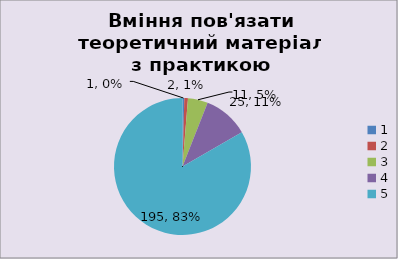
| Category | Кількість | % |
|---|---|---|
| 0 | 1 | 0.004 |
| 1 | 2 | 0.009 |
| 2 | 11 | 0.047 |
| 3 | 25 | 0.107 |
| 4 | 195 | 0.833 |